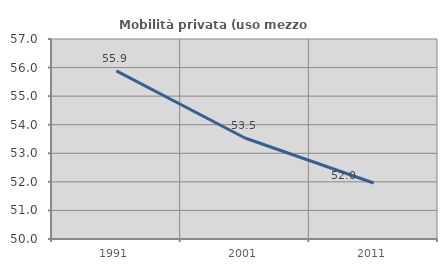
| Category | Mobilità privata (uso mezzo privato) |
|---|---|
| 1991.0 | 55.882 |
| 2001.0 | 53.535 |
| 2011.0 | 51.961 |